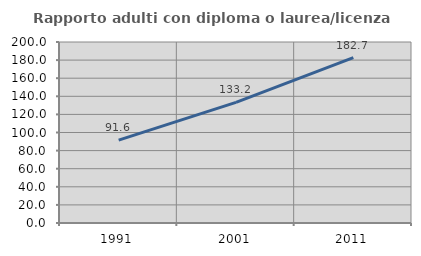
| Category | Rapporto adulti con diploma o laurea/licenza media  |
|---|---|
| 1991.0 | 91.565 |
| 2001.0 | 133.224 |
| 2011.0 | 182.748 |